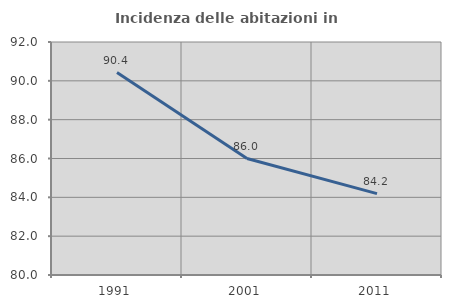
| Category | Incidenza delle abitazioni in proprietà  |
|---|---|
| 1991.0 | 90.426 |
| 2001.0 | 86 |
| 2011.0 | 84.19 |